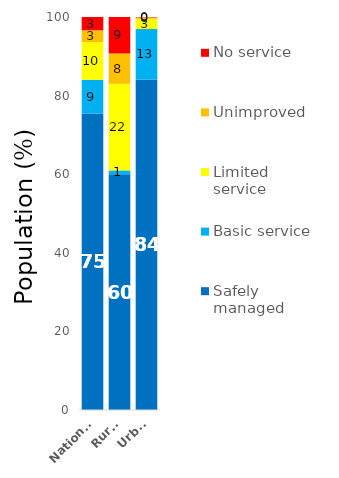
| Category | Safely managed | Basic service | Limited service | Unimproved | No service |
|---|---|---|---|---|---|
| National | 75.44 | 8.582 | 9.587 | 3.001 | 3.391 |
| Rural | 59.982 | 0.99 | 22.036 | 7.711 | 9.281 |
| Urban | 84.096 | 12.833 | 2.615 | 0.363 | 0.092 |